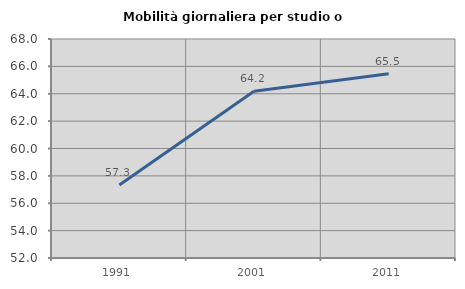
| Category | Mobilità giornaliera per studio o lavoro |
|---|---|
| 1991.0 | 57.333 |
| 2001.0 | 64.177 |
| 2011.0 | 65.456 |